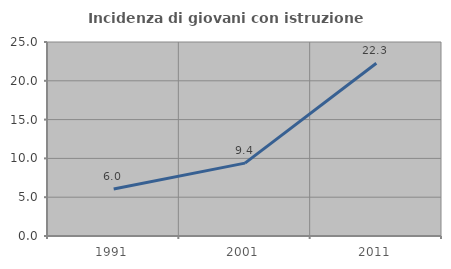
| Category | Incidenza di giovani con istruzione universitaria |
|---|---|
| 1991.0 | 6.045 |
| 2001.0 | 9.391 |
| 2011.0 | 22.267 |